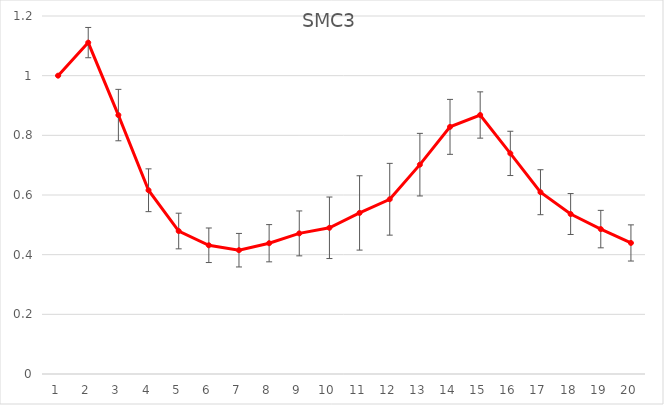
| Category | SMC3 |
|---|---|
| 0 | 1 |
| 1 | 1.111 |
| 2 | 0.868 |
| 3 | 0.616 |
| 4 | 0.479 |
| 5 | 0.431 |
| 6 | 0.415 |
| 7 | 0.438 |
| 8 | 0.471 |
| 9 | 0.49 |
| 10 | 0.54 |
| 11 | 0.586 |
| 12 | 0.702 |
| 13 | 0.828 |
| 14 | 0.868 |
| 15 | 0.739 |
| 16 | 0.609 |
| 17 | 0.536 |
| 18 | 0.486 |
| 19 | 0.439 |